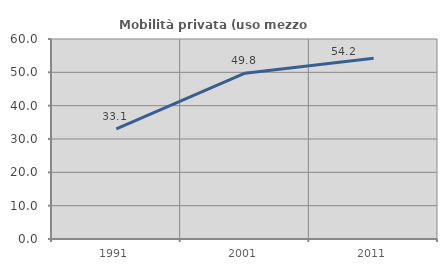
| Category | Mobilità privata (uso mezzo privato) |
|---|---|
| 1991.0 | 33.051 |
| 2001.0 | 49.756 |
| 2011.0 | 54.206 |